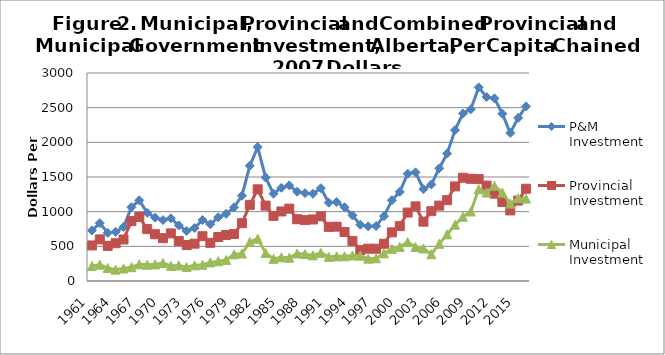
| Category | P&M Investment | Provincial Investment | Municipal Investment  |
|---|---|---|---|
| 1961.0 | 728.979 | 512.763 | 216.216 |
| 1962.0 | 834.916 | 599.708 | 235.208 |
| 1963.0 | 694.227 | 506.058 | 188.168 |
| 1964.0 | 708.392 | 544.755 | 163.636 |
| 1965.0 | 779.31 | 598.621 | 180.69 |
| 1966.0 | 1063.423 | 863.86 | 199.563 |
| 1967.0 | 1163.758 | 923.49 | 240.268 |
| 1968.0 | 982.94 | 748.688 | 234.252 |
| 1969.0 | 914.047 | 674.792 | 239.256 |
| 1970.0 | 878.37 | 617.555 | 260.815 |
| 1971.0 | 904.115 | 686.791 | 217.324 |
| 1972.0 | 801.02 | 576.121 | 224.9 |
| 1973.0 | 721.023 | 518.742 | 202.28 |
| 1974.0 | 764.268 | 538.578 | 225.69 |
| 1975.0 | 879.643 | 646.324 | 233.318 |
| 1976.0 | 818.494 | 550.477 | 268.017 |
| 1977.0 | 919.28 | 634.411 | 284.869 |
| 1978.0 | 968.233 | 664.609 | 303.624 |
| 1979.0 | 1062.487 | 678.123 | 384.365 |
| 1980.0 | 1229.559 | 833.855 | 395.704 |
| 1981.0 | 1660.771 | 1098.161 | 562.611 |
| 1982.0 | 1932.631 | 1322.459 | 610.171 |
| 1983.0 | 1491.903 | 1087.489 | 404.414 |
| 1984.0 | 1259.03 | 939.051 | 319.979 |
| 1985.0 | 1344.152 | 1002.707 | 341.445 |
| 1986.0 | 1379.407 | 1043.598 | 335.809 |
| 1987.0 | 1287.652 | 890.663 | 396.988 |
| 1988.0 | 1267.598 | 878.445 | 389.154 |
| 1989.0 | 1257.643 | 887.795 | 369.848 |
| 1990.0 | 1338.416 | 932.181 | 406.235 |
| 1991.0 | 1129.496 | 780.772 | 348.724 |
| 1992.0 | 1138.387 | 783.235 | 355.152 |
| 1993.0 | 1064 | 706.709 | 357.291 |
| 1994.0 | 946.084 | 578.389 | 367.695 |
| 1995.0 | 811.112 | 446.148 | 364.964 |
| 1996.0 | 788.431 | 466.284 | 322.147 |
| 1997.0 | 792.975 | 465.749 | 327.226 |
| 1998.0 | 935.819 | 537.414 | 398.404 |
| 1999.0 | 1165.039 | 701.733 | 463.306 |
| 2000.0 | 1284.869 | 792.225 | 492.644 |
| 2001.0 | 1547.701 | 987.219 | 560.482 |
| 2002.0 | 1567.004 | 1075.997 | 491.007 |
| 2003.0 | 1325.227 | 855.836 | 469.39 |
| 2004.0 | 1392.669 | 1006.983 | 385.686 |
| 2005.0 | 1624.5 | 1087.716 | 536.783 |
| 2006.0 | 1838.45 | 1165.91 | 672.539 |
| 2007.0 | 2175.849 | 1363.961 | 811.888 |
| 2008.0 | 2416.182 | 1488.978 | 927.204 |
| 2009.0 | 2476.698 | 1474.277 | 1002.421 |
| 2010.0 | 2792.98 | 1469.228 | 1323.752 |
| 2011.0 | 2652.637 | 1375.92 | 1276.717 |
| 2012.0 | 2634.281 | 1259.806 | 1374.475 |
| 2013.0 | 2412.486 | 1138.834 | 1273.653 |
| 2014.0 | 2135.129 | 1017.911 | 1117.219 |
| 2015.0 | 2352.827 | 1160.016 | 1192.811 |
| 2016.0 | 2518.662 | 1330.382 | 1188.28 |